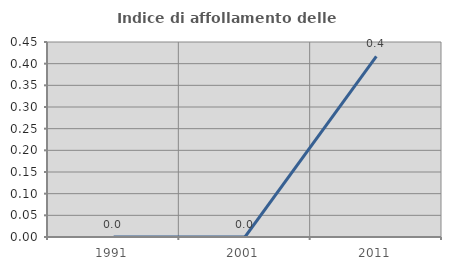
| Category | Indice di affollamento delle abitazioni  |
|---|---|
| 1991.0 | 0 |
| 2001.0 | 0 |
| 2011.0 | 0.417 |